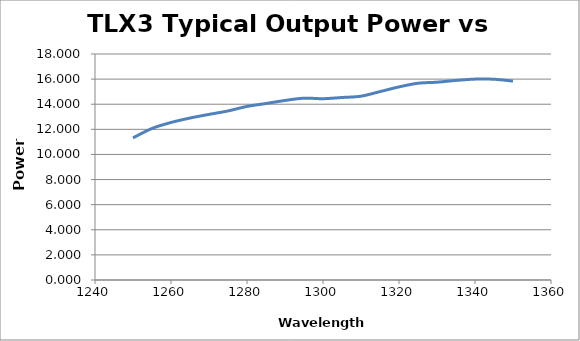
| Category | Power (dBm) |
|---|---|
| 1250.0 | 11.32 |
| 1255.0 | 12.07 |
| 1260.0 | 12.545 |
| 1265.0 | 12.9 |
| 1270.0 | 13.19 |
| 1275.0 | 13.465 |
| 1280.0 | 13.825 |
| 1285.0 | 14.055 |
| 1290.0 | 14.3 |
| 1295.0 | 14.48 |
| 1300.0 | 14.44 |
| 1305.0 | 14.535 |
| 1310.0 | 14.64 |
| 1315.0 | 15.005 |
| 1320.0 | 15.38 |
| 1325.0 | 15.67 |
| 1330.0 | 15.755 |
| 1335.0 | 15.895 |
| 1340.0 | 16 |
| 1345.0 | 15.99 |
| 1350.0 | 15.84 |